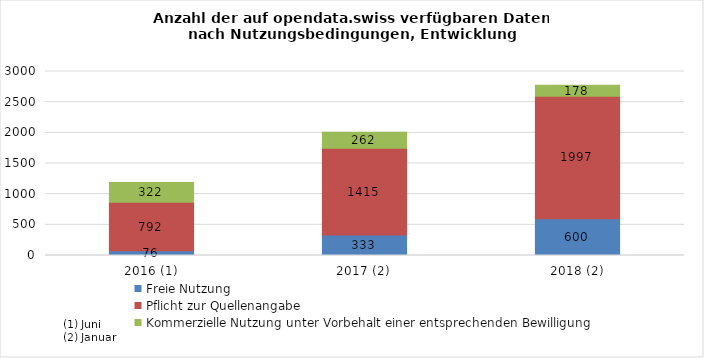
| Category | Freie Nutzung | Pflicht zur Quellenangabe | Kommerzielle Nutzung unter Vorbehalt einer entsprechenden Bewilligung |
|---|---|---|---|
| 2016 (1) | 76 | 792 | 322 |
| 2017 (2) | 333 | 1415 | 262 |
| 2018 (2) | 600 | 1997 | 178 |